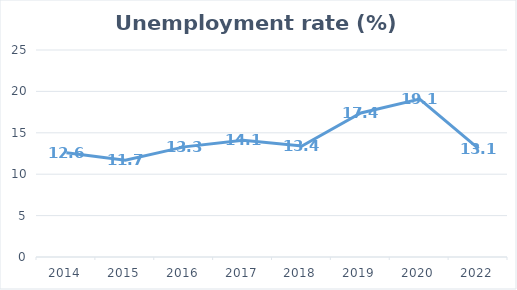
| Category | Unemployment rate (%) |
|---|---|
| 2014 | 12.6 |
| 2015 | 11.7 |
| 2016 | 13.3 |
| 2017 | 14.1 |
| 2018 | 13.4 |
| 2019 | 17.4 |
| 2020 | 19.069 |
| 2022 | 13.1 |